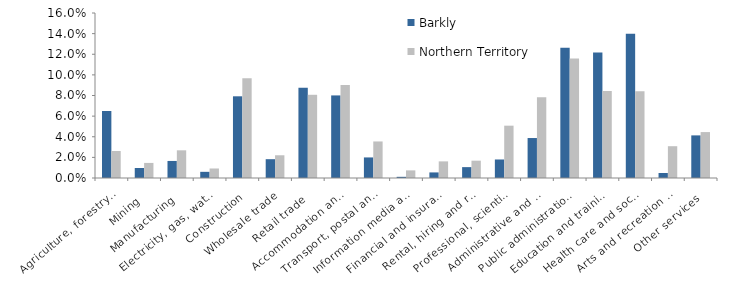
| Category | Barkly | Northern Territory |
|---|---|---|
| Agriculture, forestry and fishing | 0.065 | 0.026 |
| Mining | 0.01 | 0.015 |
| Manufacturing | 0.017 | 0.027 |
| Electricity, gas, water and waste services | 0.006 | 0.009 |
| Construction | 0.079 | 0.097 |
| Wholesale trade | 0.018 | 0.022 |
| Retail trade | 0.087 | 0.081 |
| Accommodation and food services | 0.08 | 0.09 |
| Transport, postal and warehousing | 0.02 | 0.035 |
| Information media and telecommunications | 0.001 | 0.007 |
| Financial and insurance services | 0.005 | 0.016 |
| Rental, hiring and real estate services | 0.011 | 0.017 |
| Professional, scientific and technical services | 0.018 | 0.051 |
| Administrative and support services | 0.039 | 0.078 |
| Public administration and safety | 0.126 | 0.116 |
| Education and training | 0.122 | 0.084 |
| Health care and social assistance | 0.14 | 0.084 |
| Arts and recreation services | 0.005 | 0.031 |
| Other services | 0.041 | 0.045 |